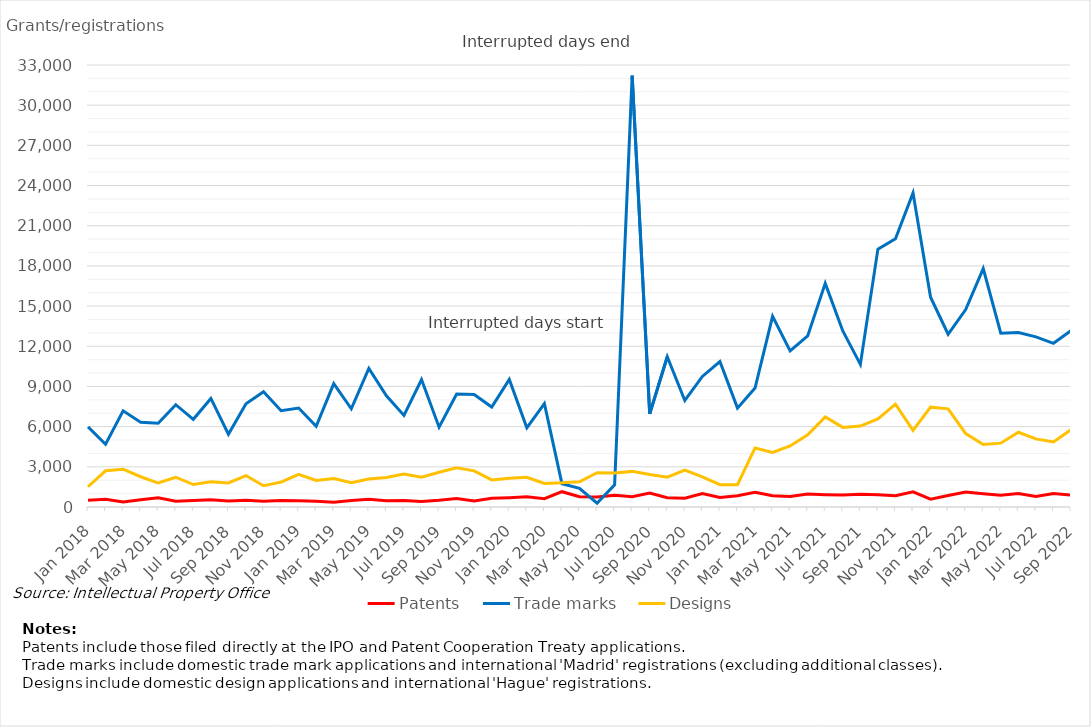
| Category | Patents | Trade marks | Designs |
|---|---|---|---|
| Jan 2018 | 495 | 5979 | 1512 |
| Feb 2018 | 574 | 4686 | 2704 |
| Mar 2018 | 370 | 7178 | 2825 |
| Apr 2018 | 543 | 6334 | 2259 |
| May 2018 | 690 | 6253 | 1789 |
| Jun 2018 | 424 | 7637 | 2222 |
| Jul 2018 | 486 | 6549 | 1678 |
| Aug 2018 | 536 | 8104 | 1878 |
| Sep 2018 | 450 | 5429 | 1795 |
| Oct 2018 | 498 | 7701 | 2348 |
| Nov 2018 | 432 | 8604 | 1592 |
| Dec 2018 | 484 | 7190 | 1859 |
| Jan 2019 | 474 | 7392 | 2444 |
| Feb 2019 | 426 | 6023 | 1987 |
| Mar 2019 | 363 | 9208 | 2125 |
| Apr 2019 | 488 | 7336 | 1810 |
| May 2019 | 573 | 10344 | 2096 |
| Jun 2019 | 471 | 8304 | 2202 |
| Jul 2019 | 489 | 6840 | 2464 |
| Aug 2019 | 420 | 9517 | 2218 |
| Sep 2019 | 500 | 5958 | 2596 |
| Oct 2019 | 634 | 8438 | 2926 |
| Nov 2019 | 455 | 8401 | 2700 |
| Dec 2019 | 654 | 7465 | 2021 |
| Jan 2020 | 696 | 9525 | 2145 |
| Feb 2020 | 756 | 5909 | 2220 |
| Mar 2020 | 622 | 7722 | 1757 |
| Apr 2020 | 1143 | 1742 | 1803 |
| May 2020 | 768 | 1399 | 1888 |
| Jun 2020 | 740 | 280 | 2564 |
| Jul 2020 | 878 | 1659 | 2539 |
| Aug 2020 | 771 | 32204 | 2659 |
| Sep 2020 | 1042 | 6949 | 2425 |
| Oct 2020 | 697 | 11220 | 2223 |
| Nov 2020 | 649 | 7955 | 2763 |
| Dec 2020 | 1010 | 9749 | 2252 |
| Jan 2021 | 708 | 10856 | 1665 |
| Feb 2021 | 838 | 7380 | 1660 |
| Mar 2021 | 1107 | 8877 | 4408 |
| Apr 2021 | 838 | 14232 | 4075 |
| May 2021 | 788 | 11654 | 4562 |
| Jun 2021 | 972 | 12772 | 5385 |
| Jul 2021 | 918 | 16695 | 6731 |
| Aug 2021 | 887 | 13145 | 5944 |
| Sep 2021 | 947 | 10649 | 6041 |
| Oct 2021 | 920 | 19252 | 6577 |
| Nov 2021 | 841 | 20030 | 7679 |
| Dec 2021 | 1131 | 23452 | 5720 |
| Jan 2022 | 585 | 15663 | 7455 |
| Feb 2022 | 860 | 12897 | 7329 |
| Mar 2022 | 1111 | 14745 | 5482 |
| Apr 2022 | 990 | 17798 | 4663 |
| May 2022 | 883 | 12977 | 4767 |
| Jun 2022 | 1010 | 13032 | 5579 |
| Jul 2022 | 788 | 12700 | 5083 |
| Aug 2022 | 1007 | 12221 | 4857 |
| Sep 2022 | 889 | 13169 | 5777 |